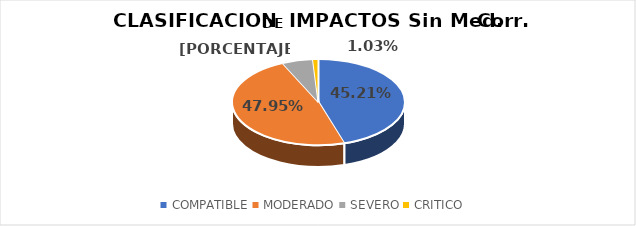
| Category | Series 0 |
|---|---|
| COMPATIBLE | 132 |
| MODERADO | 140 |
| SEVERO | 17 |
| CRITICO | 3 |